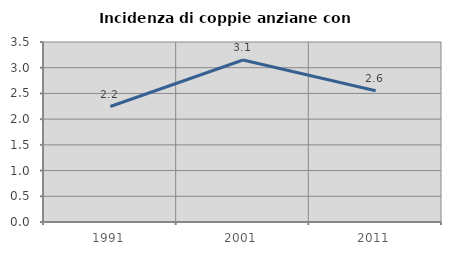
| Category | Incidenza di coppie anziane con figli |
|---|---|
| 1991.0 | 2.245 |
| 2001.0 | 3.149 |
| 2011.0 | 2.553 |